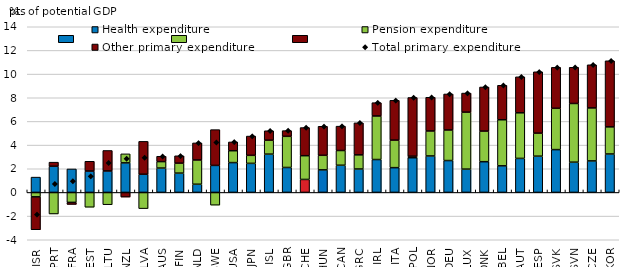
| Category | Health expenditure | Pension expenditure | Other primary expenditure |
|---|---|---|---|
| ISR | 1.294 | -0.374 | -2.78 |
| PRT | 2.214 | -1.82 | 0.344 |
| FRA | 1.984 | -0.842 | -0.171 |
| EST | 1.805 | -1.251 | 0.828 |
| LTU | 1.813 | -1.039 | 1.732 |
| NZL | 2.497 | 0.762 | -0.392 |
| LVA | 1.536 | -1.369 | 2.779 |
| AUS | 2.058 | 0.546 | 0.452 |
| FIN | 1.631 | 0.843 | 0.621 |
| NLD | 0.693 | 2.049 | 1.444 |
| SWE | 2.281 | -1.076 | 3.025 |
| USA | 2.521 | 1.003 | 0.743 |
| JPN | 2.456 | 0.679 | 1.628 |
| ISL | 3.237 | 1.179 | 0.797 |
| GBR | 2.107 | 2.633 | 0.483 |
| CHE | 1.096 | 2.007 | 2.379 |
| HUN | 1.907 | 1.231 | 2.451 |
| CAN | 2.298 | 1.244 | 2.059 |
| GRC | 1.979 | 1.195 | 2.705 |
| IRL | 2.78 | 3.68 | 1.125 |
| ITA | 2.094 | 2.327 | 3.363 |
| POL | 2.932 | 0.129 | 4.961 |
| NOR | 3.082 | 2.112 | 2.849 |
| DEU | 2.694 | 2.583 | 3.043 |
| LUX | 1.97 | 4.814 | 1.613 |
| DNK | 2.596 | 2.587 | 3.727 |
| BEL | 2.248 | 3.893 | 2.915 |
| AUT | 2.875 | 3.853 | 3.042 |
| ESP | 3.066 | 1.944 | 5.185 |
| SVK | 3.618 | 3.491 | 3.461 |
| SVN | 2.557 | 4.959 | 3.061 |
| CZE | 2.664 | 4.477 | 3.646 |
| KOR | 3.249 | 2.29 | 5.586 |